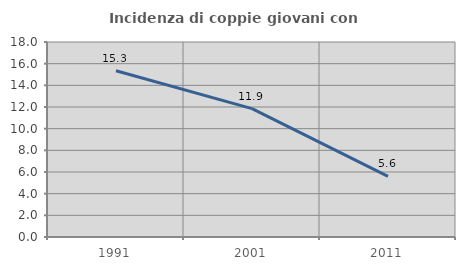
| Category | Incidenza di coppie giovani con figli |
|---|---|
| 1991.0 | 15.345 |
| 2001.0 | 11.852 |
| 2011.0 | 5.6 |